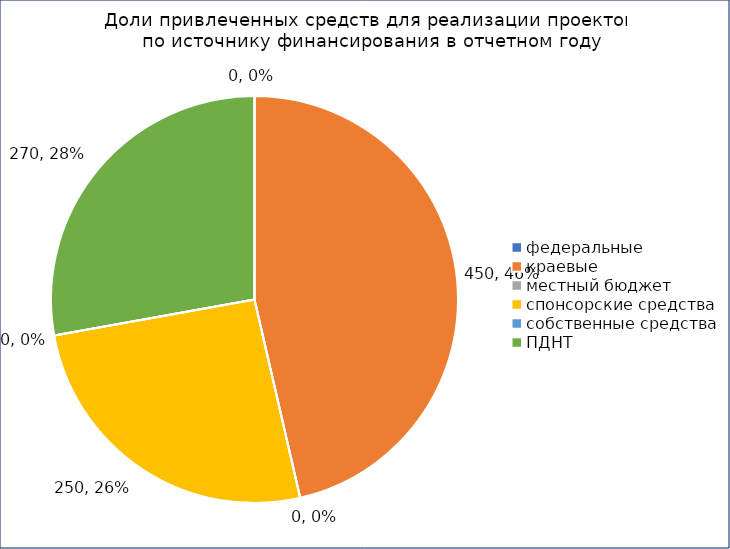
| Category | Сумма |
|---|---|
| федеральные | 0 |
| краевые | 450 |
| местный бюджет  | 0 |
| спонсорские средства | 250 |
| собственные средства | 0 |
| ПДНТ | 270 |